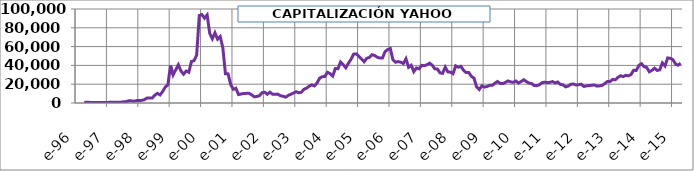
| Category | CAPITALIZACIÓN YAHOO (Mill $) |
|---|---|
| 1996-04-12 | 848.2 |
| 1996-05-12 | 803.22 |
| 1996-06-12 | 668.28 |
| 1996-07-12 | 449.8 |
| 1996-08-12 | 452.64 |
| 1996-09-12 | 511.68 |
| 1996-10-12 | 541.65 |
| 1996-11-12 | 518.67 |
| 1996-12-12 | 525.24 |
| 1997-01-12 | 510.49 |
| 1997-02-12 | 944.74 |
| 1997-03-12 | 679.55 |
| 1997-04-12 | 911.92 |
| 1997-05-12 | 870.4 |
| 1997-06-12 | 888.86 |
| 1997-07-12 | 1222.19 |
| 1997-08-12 | 1456.66 |
| 1997-09-12 | 2313.65 |
| 1997-10-12 | 2265.39 |
| 1997-11-12 | 1874.85 |
| 1997-12-12 | 2564.45 |
| 1998-01-12 | 2693.75 |
| 1998-02-12 | 2806.89 |
| 1998-03-12 | 3534.2 |
| 1998-04-12 | 5247.53 |
| 1998-05-12 | 5301.96 |
| 1998-06-12 | 5268.04 |
| 1998-07-12 | 8389.52 |
| 1998-08-12 | 10240.22 |
| 1998-09-12 | 8576.02 |
| 1998-10-12 | 12286.92 |
| 1998-11-12 | 16953.55 |
| 1998-12-12 | 19312.59 |
| 1999-01-12 | 39673.78 |
| 1999-02-12 | 29804.67 |
| 1999-03-12 | 35289.91 |
| 1999-04-12 | 40691.17 |
| 1999-05-12 | 34074.32 |
| 1999-06-12 | 30626.14 |
| 1999-07-12 | 34022.75 |
| 1999-08-12 | 32738.95 |
| 1999-09-12 | 44158.61 |
| 1999-10-12 | 45032.73 |
| 1999-11-12 | 51005.77 |
| 1999-12-12 | 93055.25 |
| 2000-01-12 | 94124.69 |
| 2000-02-12 | 90209 |
| 2000-03-12 | 93746.31 |
| 2000-04-12 | 73985.75 |
| 2000-05-12 | 68281.44 |
| 2000-06-12 | 74664.81 |
| 2000-07-12 | 67874 |
| 2000-08-12 | 70658.44 |
| 2000-09-12 | 58779.03 |
| 2000-10-12 | 31106.2 |
| 2000-11-12 | 31003.2 |
| 2000-12-12 | 19673.13 |
| 2001-01-12 | 14591.76 |
| 2001-02-12 | 15656.1 |
| 2001-03-12 | 8995.39 |
| 2001-04-12 | 9592.55 |
| 2001-05-12 | 10085.23 |
| 2001-06-12 | 10266.64 |
| 2001-07-12 | 10351.68 |
| 2001-08-12 | 8741.67 |
| 2001-09-12 | 6655.46 |
| 2001-10-12 | 6848.21 |
| 2001-11-12 | 7803.68 |
| 2001-12-12 | 10902.37 |
| 2002-01-12 | 11483.37 |
| 2002-02-12 | 9301.75 |
| 2002-03-12 | 11518.68 |
| 2002-04-12 | 9352.98 |
| 2002-05-12 | 9243.39 |
| 2002-06-12 | 9464.61 |
| 2002-07-12 | 7736.7 |
| 2002-08-12 | 7188.83 |
| 2002-09-12 | 6215.91 |
| 2002-10-12 | 8023.63 |
| 2002-11-12 | 9296.83 |
| 2002-12-12 | 10588.05 |
| 2003-01-12 | 12011.41 |
| 2003-02-12 | 10912.37 |
| 2003-03-12 | 11466.32 |
| 2003-04-12 | 14597.31 |
| 2003-05-12 | 15786.31 |
| 2003-06-12 | 17915.69 |
| 2003-07-12 | 19417.7 |
| 2003-08-12 | 18211.95 |
| 2003-09-12 | 21244.23 |
| 2003-10-12 | 26445.49 |
| 2003-11-12 | 27956.41 |
| 2003-12-12 | 28252.21 |
| 2004-01-12 | 32695.78 |
| 2004-02-12 | 31236.5 |
| 2004-03-12 | 28615.17 |
| 2004-04-12 | 36676.92 |
| 2004-05-12 | 36469.38 |
| 2004-06-12 | 43633.95 |
| 2004-07-12 | 40751.98 |
| 2004-08-12 | 37483.88 |
| 2004-09-12 | 42286.71 |
| 2004-10-12 | 46572.5 |
| 2004-11-12 | 51968.12 |
| 2004-12-12 | 52270.57 |
| 2005-01-12 | 49685.91 |
| 2005-02-12 | 46950.03 |
| 2005-03-12 | 43904.04 |
| 2005-04-12 | 47552.35 |
| 2005-05-12 | 48470.91 |
| 2005-06-12 | 51403.49 |
| 2005-07-12 | 50593.54 |
| 2005-08-12 | 48749.73 |
| 2005-09-12 | 47777.54 |
| 2005-10-12 | 47805.73 |
| 2005-11-12 | 54607.13 |
| 2005-12-12 | 56862.88 |
| 2006-01-12 | 58012.1 |
| 2006-02-12 | 46123.09 |
| 2006-03-12 | 43357.92 |
| 2006-04-12 | 44095.2 |
| 2006-05-12 | 43405.14 |
| 2006-06-12 | 41954.11 |
| 2006-07-12 | 47025.77 |
| 2006-08-12 | 37982.34 |
| 2006-09-12 | 40178.4 |
| 2006-10-12 | 33313.95 |
| 2006-11-12 | 37256.36 |
| 2006-12-12 | 36385.82 |
| 2007-01-12 | 40058.41 |
| 2007-02-12 | 39677.55 |
| 2007-03-12 | 40682.62 |
| 2007-04-12 | 42337.6 |
| 2007-05-12 | 40382.79 |
| 2007-06-12 | 36351.23 |
| 2007-07-12 | 36230.29 |
| 2007-08-12 | 32068.86 |
| 2007-09-12 | 31559.84 |
| 2007-10-12 | 38150.43 |
| 2007-11-12 | 33117.08 |
| 2007-12-12 | 32796.32 |
| 2008-01-12 | 31219.31 |
| 2008-02-12 | 39518.64 |
| 2008-03-12 | 38042.34 |
| 2008-04-12 | 38995.41 |
| 2008-05-12 | 34753.61 |
| 2008-06-12 | 32359.64 |
| 2008-07-12 | 32428.44 |
| 2008-08-12 | 28311.68 |
| 2008-09-12 | 26440.85 |
| 2008-10-12 | 17031.36 |
| 2008-11-12 | 14329.06 |
| 2008-12-12 | 18223.13 |
| 2009-01-12 | 16934.35 |
| 2009-02-12 | 17544.1 |
| 2009-03-12 | 18961.13 |
| 2009-04-12 | 18779.88 |
| 2009-05-12 | 21074.36 |
| 2009-06-12 | 22888.7 |
| 2009-07-12 | 20837.09 |
| 2009-08-12 | 20601.76 |
| 2009-09-12 | 21878.84 |
| 2009-10-12 | 23506.78 |
| 2009-11-12 | 22416.91 |
| 2009-12-12 | 22052.63 |
| 2010-01-12 | 23369.62 |
| 2010-02-12 | 21254.03 |
| 2010-03-12 | 22851.27 |
| 2010-04-12 | 24699.54 |
| 2010-05-12 | 22811.96 |
| 2010-06-12 | 21177.61 |
| 2010-07-12 | 20692.84 |
| 2010-08-12 | 18673.66 |
| 2010-09-12 | 18444.45 |
| 2010-10-12 | 19455.66 |
| 2010-11-12 | 21572.89 |
| 2010-12-12 | 22172.51 |
| 2011-01-12 | 21703.25 |
| 2011-02-12 | 21963.94 |
| 2011-03-12 | 22809.97 |
| 2011-04-12 | 21421.97 |
| 2011-05-12 | 22371.49 |
| 2011-06-12 | 19804.7 |
| 2011-07-12 | 19361.7 |
| 2011-08-12 | 17152.59 |
| 2011-09-12 | 18004.86 |
| 2011-10-12 | 19911.4 |
| 2011-11-12 | 20179.64 |
| 2011-12-12 | 19187.42 |
| 2012-01-12 | 19423.08 |
| 2012-02-12 | 20018.42 |
| 2012-03-12 | 17587.22 |
| 2012-04-12 | 18272.98 |
| 2012-05-12 | 18512 |
| 2012-06-12 | 18916.7 |
| 2012-07-12 | 19185.71 |
| 2012-08-12 | 17946.94 |
| 2012-09-12 | 18243.1 |
| 2012-10-12 | 18811.71 |
| 2012-11-12 | 20708.88 |
| 2012-12-12 | 22920.5 |
| 2013-01-12 | 22814.06 |
| 2013-02-12 | 25084.82 |
| 2013-03-12 | 24669 |
| 2013-04-12 | 27190.95 |
| 2013-05-12 | 29047.08 |
| 2013-06-12 | 28029.41 |
| 2013-07-12 | 29480.14 |
| 2013-08-12 | 28926.09 |
| 2013-09-12 | 30252.51 |
| 2013-10-12 | 34843.96 |
| 2013-11-12 | 34562.04 |
| 2013-12-12 | 39918.29 |
| 2014-01-12 | 41825.45 |
| 2014-02-12 | 38660.38 |
| 2014-03-12 | 37852.2 |
| 2014-04-12 | 33177.09 |
| 2014-05-12 | 34684.54 |
| 2014-06-12 | 37030.4 |
| 2014-07-12 | 34685.96 |
| 2014-08-12 | 35328.31 |
| 2014-09-12 | 42648.59 |
| 2014-10-12 | 39386.29 |
| 2014-11-12 | 47935.98 |
| 2014-12-12 | 47594.9 |
| 2015-01-12 | 46230.73 |
| 2015-02-12 | 41612.41 |
| 2015-03-12 | 40206.38 |
| 2015-04-12 | 42293.93 |